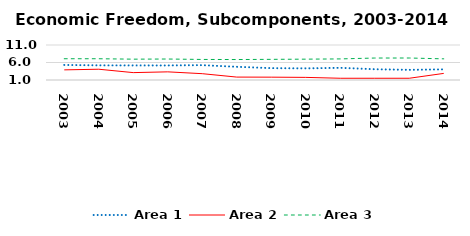
| Category | Area 1 | Area 2 | Area 3 |
|---|---|---|---|
| 2003.0 | 5.295 | 3.897 | 7.072 |
| 2004.0 | 5.19 | 4.079 | 7.074 |
| 2005.0 | 5.157 | 3.108 | 6.954 |
| 2006.0 | 5.163 | 3.329 | 6.994 |
| 2007.0 | 5.244 | 2.805 | 6.872 |
| 2008.0 | 4.772 | 1.834 | 6.845 |
| 2009.0 | 4.389 | 1.811 | 6.901 |
| 2010.0 | 4.323 | 1.75 | 6.955 |
| 2011.0 | 4.48 | 1.5 | 7.026 |
| 2012.0 | 4.079 | 1.5 | 7.276 |
| 2013.0 | 3.9 | 1.5 | 7.284 |
| 2014.0 | 4.043 | 2.887 | 7.045 |